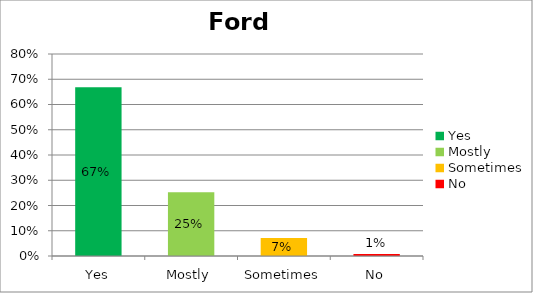
| Category | Ford |
|---|---|
| Yes | 0.668 |
| Mostly  | 0.252 |
| Sometimes | 0.071 |
| No | 0.008 |